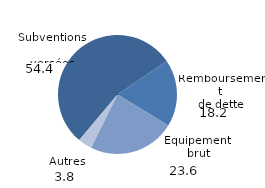
| Category | Series 0 |
|---|---|
| 0 | 54.422 |
| 1 | 18.193 |
| 2 | 23.613 |
| 3 | 3.772 |